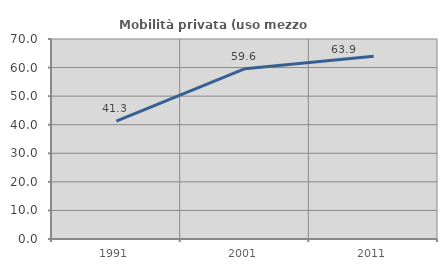
| Category | Mobilità privata (uso mezzo privato) |
|---|---|
| 1991.0 | 41.252 |
| 2001.0 | 59.608 |
| 2011.0 | 63.942 |